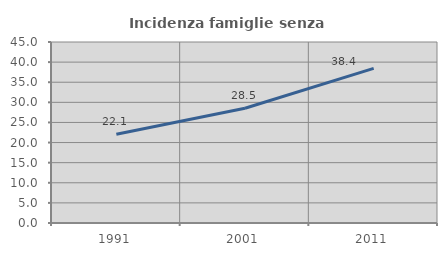
| Category | Incidenza famiglie senza nuclei |
|---|---|
| 1991.0 | 22.058 |
| 2001.0 | 28.523 |
| 2011.0 | 38.438 |